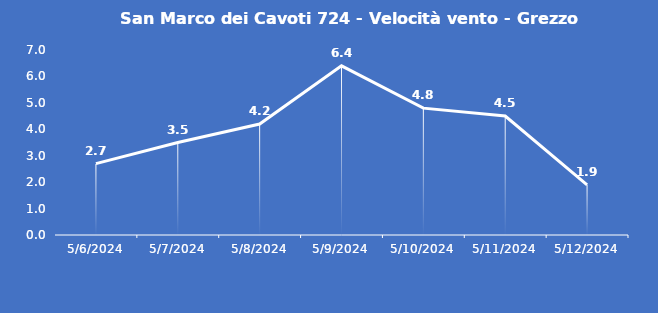
| Category | San Marco dei Cavoti 724 - Velocità vento - Grezzo (m/s) |
|---|---|
| 5/6/24 | 2.7 |
| 5/7/24 | 3.5 |
| 5/8/24 | 4.2 |
| 5/9/24 | 6.4 |
| 5/10/24 | 4.8 |
| 5/11/24 | 4.5 |
| 5/12/24 | 1.9 |